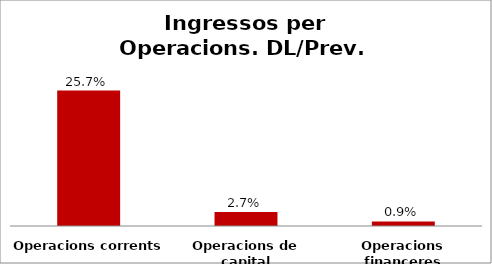
| Category | Series 0 |
|---|---|
| Operacions corrents | 0.257 |
| Operacions de capital | 0.027 |
| Operacions financeres | 0.009 |